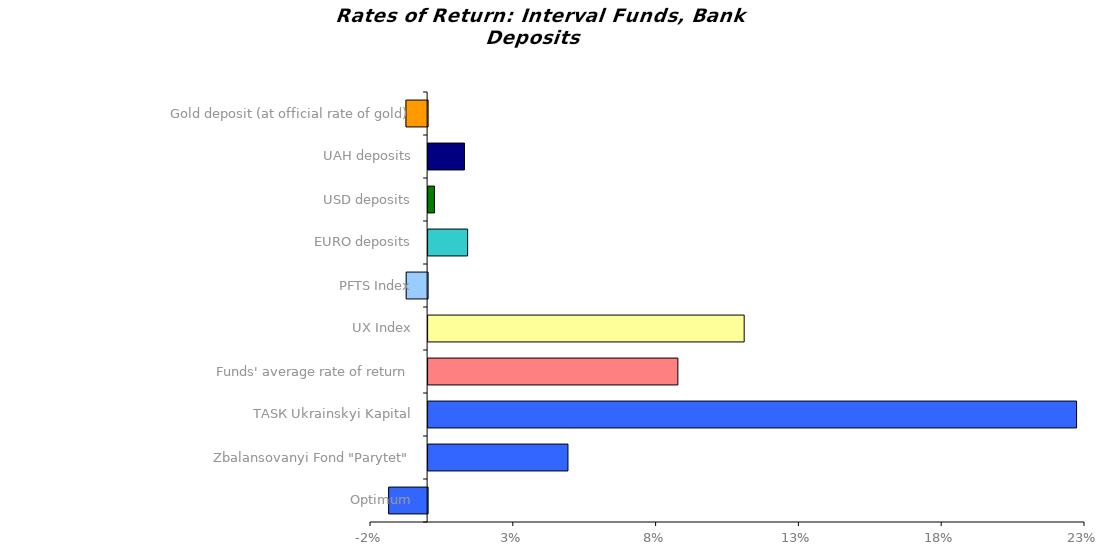
| Category | Series 0 |
|---|---|
| Optimum | -0.014 |
| Zbalansovanyi Fond "Parytet" | 0.049 |
| ТАSК Ukrainskyi Kapital | 0.227 |
| Funds' average rate of return | 0.087 |
| UX Index | 0.111 |
| PFTS Index | -0.008 |
| EURO deposits | 0.014 |
| USD deposits | 0.002 |
| UAH deposits | 0.013 |
| Gold deposit (at official rate of gold) | -0.008 |